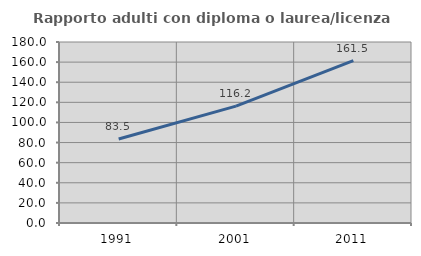
| Category | Rapporto adulti con diploma o laurea/licenza media  |
|---|---|
| 1991.0 | 83.55 |
| 2001.0 | 116.239 |
| 2011.0 | 161.475 |